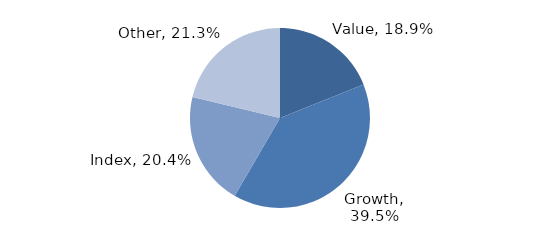
| Category | Investment Style |
|---|---|
| Value | 0.189 |
| Growth | 0.395 |
| Index | 0.204 |
| Other | 0.213 |